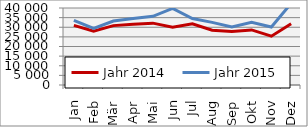
| Category | Jahr 2014 | Jahr 2015 |
|---|---|---|
| Jan | 30971.601 | 33515.577 |
| Feb | 27972.556 | 29350.892 |
| Mär | 30843.69 | 33257.916 |
| Apr | 31584.585 | 34582.868 |
| Mai | 32130.368 | 35696.631 |
| Jun | 30029.472 | 39779.316 |
| Jul | 31788.389 | 34559.751 |
| Aug | 28465.779 | 32545.018 |
| Sep | 27834.035 | 30091.338 |
| Okt | 28614.521 | 32534.076 |
| Nov | 25371.356 | 30147.619 |
| Dez | 31797.226 | 42390.667 |